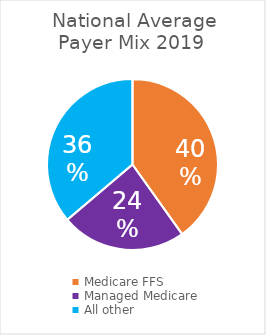
| Category | Series 0 |
|---|---|
| Medicare FFS | 0.401 |
| Managed Medicare | 0.237 |
| All other | 0.362 |